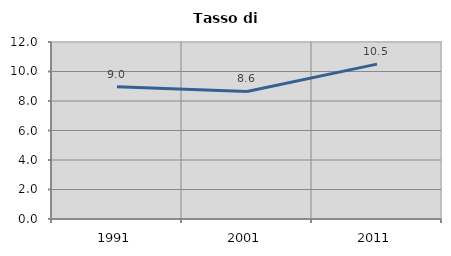
| Category | Tasso di disoccupazione   |
|---|---|
| 1991.0 | 8.974 |
| 2001.0 | 8.649 |
| 2011.0 | 10.5 |